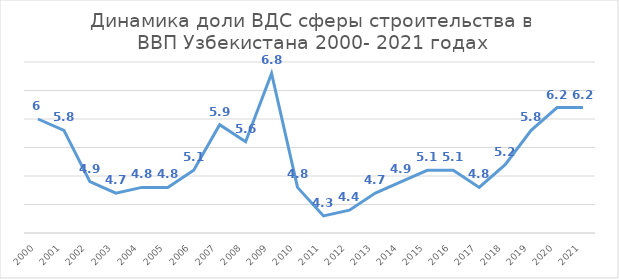
| Category | Доля ВДС "Строительство" в ВВП |
|---|---|
| 2000.0 | 6 |
| 2001.0 | 5.8 |
| 2002.0 | 4.9 |
| 2003.0 | 4.7 |
| 2004.0 | 4.8 |
| 2005.0 | 4.8 |
| 2006.0 | 5.1 |
| 2007.0 | 5.9 |
| 2008.0 | 5.6 |
| 2009.0 | 6.8 |
| 2010.0 | 4.8 |
| 2011.0 | 4.3 |
| 2012.0 | 4.4 |
| 2013.0 | 4.7 |
| 2014.0 | 4.9 |
| 2015.0 | 5.1 |
| 2016.0 | 5.1 |
| 2017.0 | 4.8 |
| 2018.0 | 5.2 |
| 2019.0 | 5.8 |
| 2020.0 | 6.2 |
| 2021.0 | 6.2 |